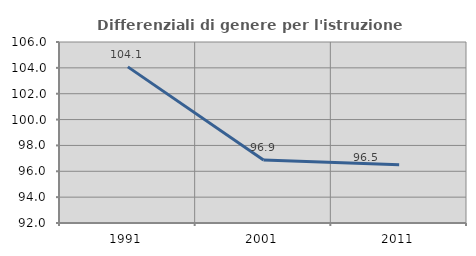
| Category | Differenziali di genere per l'istruzione superiore |
|---|---|
| 1991.0 | 104.077 |
| 2001.0 | 96.865 |
| 2011.0 | 96.502 |